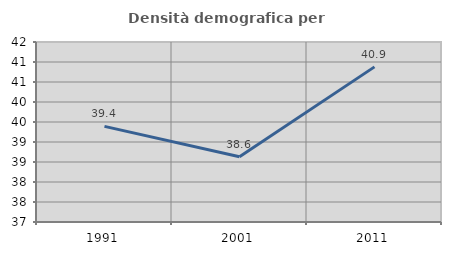
| Category | Densità demografica |
|---|---|
| 1991.0 | 39.391 |
| 2001.0 | 38.632 |
| 2011.0 | 40.878 |